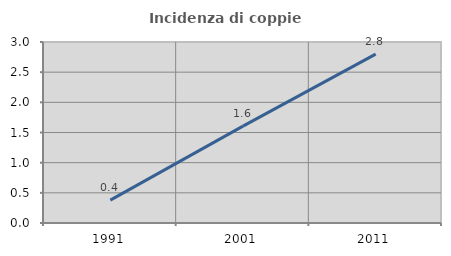
| Category | Incidenza di coppie miste |
|---|---|
| 1991.0 | 0.379 |
| 2001.0 | 1.607 |
| 2011.0 | 2.799 |